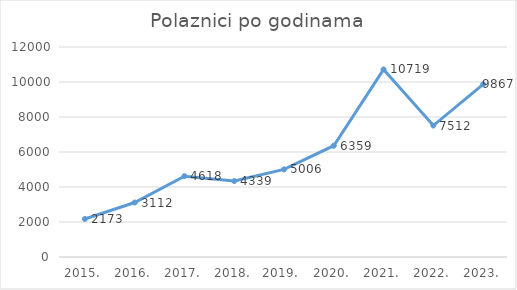
| Category | Series 0 |
|---|---|
| 2015. | 2173 |
| 2016. | 3112 |
| 2017. | 4618 |
| 2018. | 4339 |
| 2019.  | 5006 |
| 2020. | 6359 |
| 2021. | 10719 |
| 2022. | 7512 |
| 2023. | 9867 |